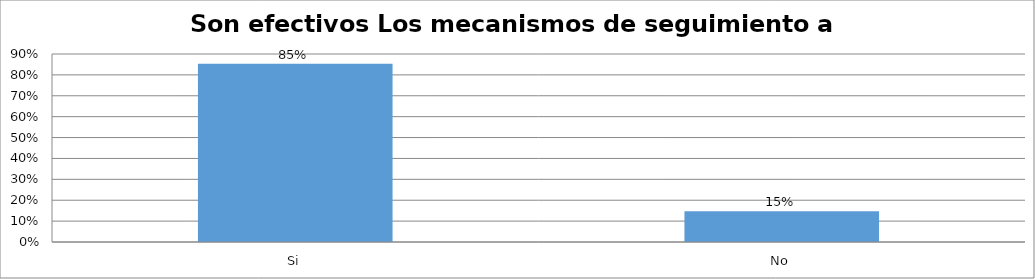
| Category | Series 0 |
|---|---|
| Si | 0.853 |
| No | 0.147 |